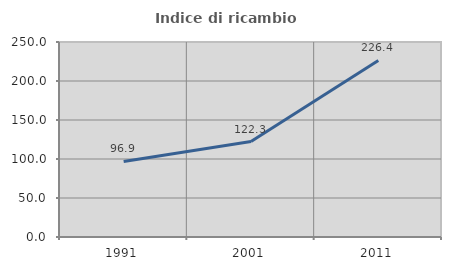
| Category | Indice di ricambio occupazionale  |
|---|---|
| 1991.0 | 96.891 |
| 2001.0 | 122.302 |
| 2011.0 | 226.4 |